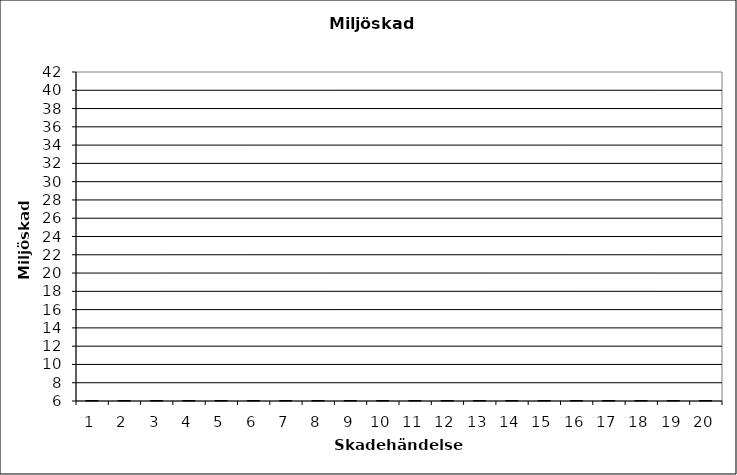
| Category | Series 0 |
|---|---|
| 0 | 0 |
| 1 | 0 |
| 2 | 0 |
| 3 | 0 |
| 4 | 0 |
| 5 | 0 |
| 6 | 0 |
| 7 | 0 |
| 8 | 0 |
| 9 | 0 |
| 10 | 0 |
| 11 | 0 |
| 12 | 0 |
| 13 | 0 |
| 14 | 0 |
| 15 | 0 |
| 16 | 0 |
| 17 | 0 |
| 18 | 0 |
| 19 | 0 |